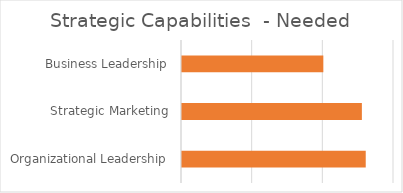
| Category | Needed |
|---|---|
| Organizational Leadership | 2.6 |
| Strategic Marketing | 2.545 |
| Business Leadership | 2 |